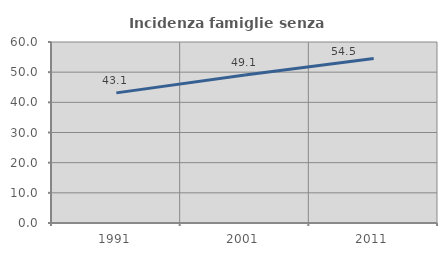
| Category | Incidenza famiglie senza nuclei |
|---|---|
| 1991.0 | 43.137 |
| 2001.0 | 49.083 |
| 2011.0 | 54.501 |